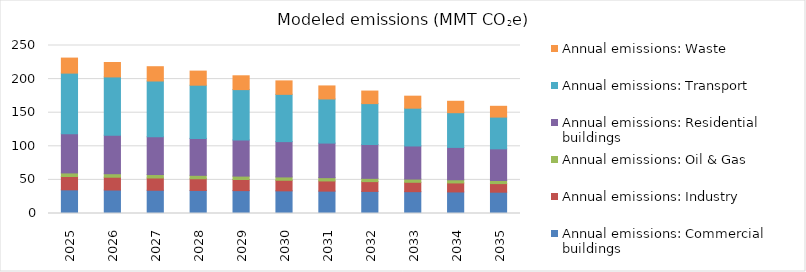
| Category | Annual emissions: Commercial buildings | Annual emissions: Industry | Annual emissions: Oil & Gas | Annual emissions: Residential buildings | Annual emissions: Transport | Annual emissions: Waste |
|---|---|---|---|---|---|---|
| 2025.0 | 35.205 | 19.883 | 5.265 | 58.385 | 90.166 | 22.368 |
| 2026.0 | 34.928 | 19.06 | 5.205 | 57.369 | 86.66 | 21.467 |
| 2027.0 | 34.595 | 18.237 | 5.143 | 56.093 | 83.089 | 21.277 |
| 2028.0 | 34.315 | 17.414 | 5.082 | 54.966 | 79.141 | 20.978 |
| 2029.0 | 34.043 | 16.59 | 5.019 | 53.851 | 74.855 | 20.562 |
| 2030.0 | 33.701 | 15.761 | 4.957 | 52.533 | 70.361 | 20.032 |
| 2031.0 | 33.282 | 15.17 | 4.894 | 51.443 | 65.643 | 19.4 |
| 2032.0 | 32.875 | 14.579 | 4.832 | 50.349 | 60.892 | 18.685 |
| 2033.0 | 32.47 | 13.988 | 4.769 | 49.266 | 56.229 | 17.872 |
| 2034.0 | 32.078 | 13.396 | 4.705 | 48.167 | 51.66 | 16.996 |
| 2035.0 | 31.69 | 12.796 | 4.642 | 47.082 | 47.248 | 16.068 |